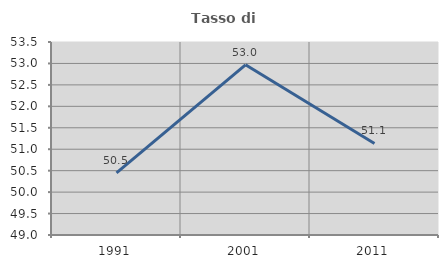
| Category | Tasso di occupazione   |
|---|---|
| 1991.0 | 50.45 |
| 2001.0 | 52.968 |
| 2011.0 | 51.135 |